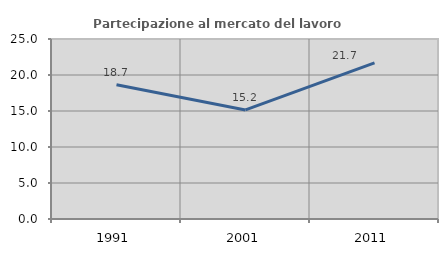
| Category | Partecipazione al mercato del lavoro  femminile |
|---|---|
| 1991.0 | 18.652 |
| 2001.0 | 15.152 |
| 2011.0 | 21.69 |